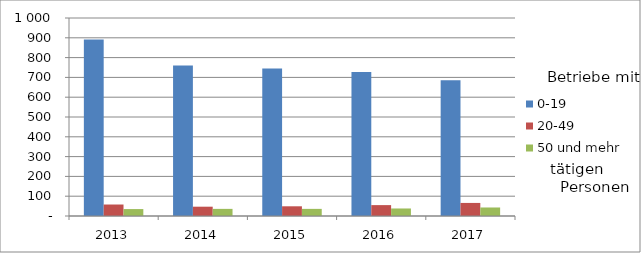
| Category | 0-19 | 20-49 | 50 und mehr |
|---|---|---|---|
| 2013.0 | 891 | 58 | 35 |
| 2014.0 | 760 | 47 | 36 |
| 2015.0 | 745 | 49 | 36 |
| 2016.0 | 727 | 55 | 38 |
| 2017.0 | 685 | 66 | 43 |